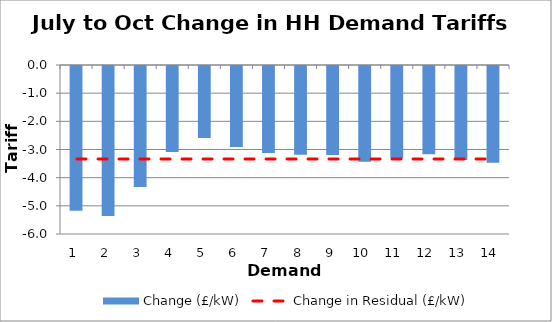
| Category | Change (£/kW) |
|---|---|
| 1.0 | -5.142 |
| 2.0 | -5.323 |
| 3.0 | -4.298 |
| 4.0 | -3.05 |
| 5.0 | -2.559 |
| 6.0 | -2.872 |
| 7.0 | -3.085 |
| 8.0 | -3.148 |
| 9.0 | -3.161 |
| 10.0 | -3.396 |
| 11.0 | -3.276 |
| 12.0 | -3.132 |
| 13.0 | -3.336 |
| 14.0 | -3.434 |